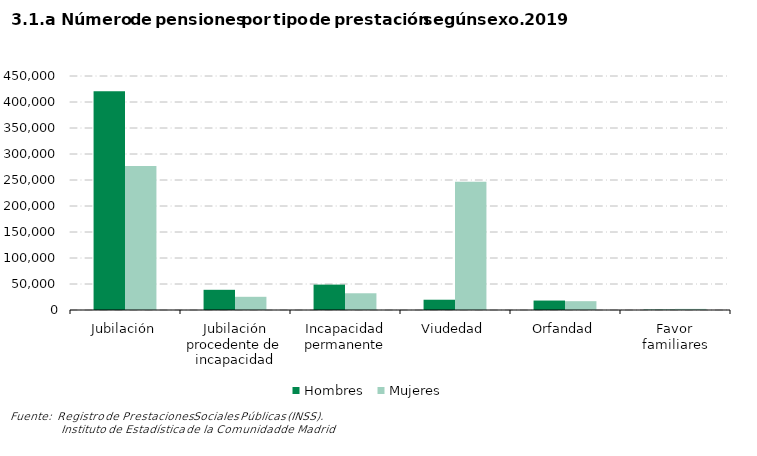
| Category | Hombres | Mujeres |
|---|---|---|
| Jubilación | 420567 | 277004 |
| Jubilación procedente de incapacidad | 38840 | 25406 |
| Incapacidad permanente | 48831 | 32182 |
| Viudedad | 19750 | 246418 |
| Orfandad | 18169 | 16964 |
| Favor familiares | 660 | 2151 |